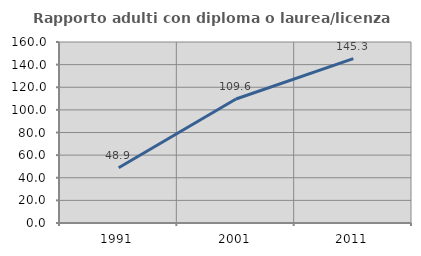
| Category | Rapporto adulti con diploma o laurea/licenza media  |
|---|---|
| 1991.0 | 48.872 |
| 2001.0 | 109.639 |
| 2011.0 | 145.255 |